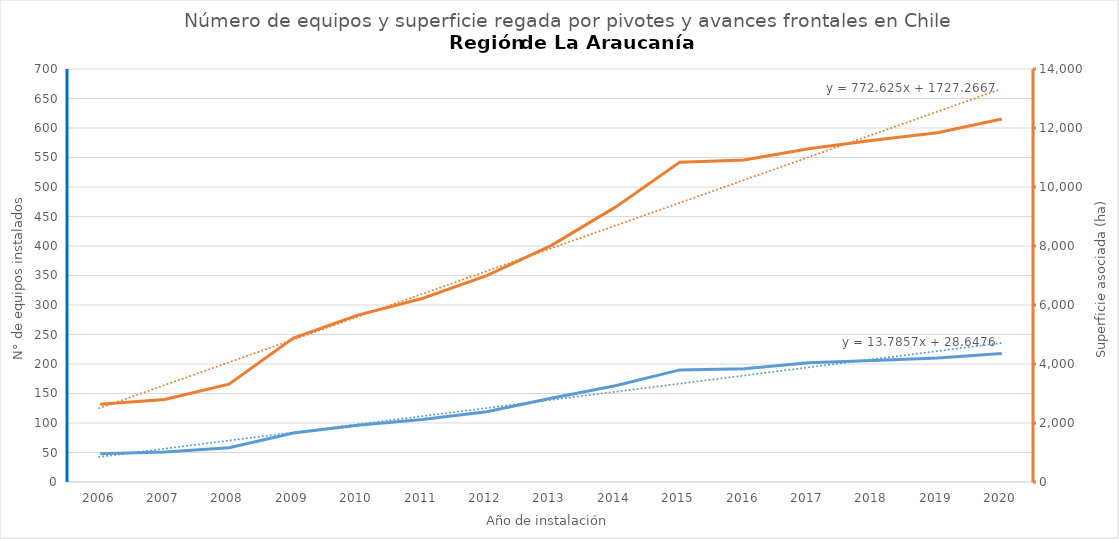
| Category | N° |
|---|---|
| 2006.0 | 48 |
| 2007.0 | 51 |
| 2008.0 | 58 |
| 2009.0 | 83 |
| 2010.0 | 96 |
| 2011.0 | 106 |
| 2012.0 | 119 |
| 2013.0 | 142 |
| 2014.0 | 163 |
| 2015.0 | 190 |
| 2016.0 | 192 |
| 2017.0 | 202 |
| 2018.0 | 206 |
| 2019.0 | 210 |
| 2020.0 | 218 |